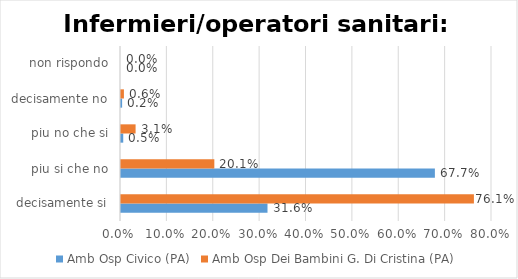
| Category | Amb Osp Civico (PA) | Amb Osp Dei Bambini G. Di Cristina (PA) |
|---|---|---|
| decisamente si | 0.316 | 0.761 |
| piu si che no | 0.677 | 0.201 |
| piu no che si | 0.005 | 0.031 |
| decisamente no | 0.002 | 0.006 |
| non rispondo | 0 | 0 |